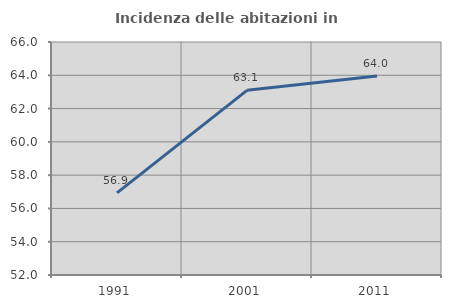
| Category | Incidenza delle abitazioni in proprietà  |
|---|---|
| 1991.0 | 56.935 |
| 2001.0 | 63.095 |
| 2011.0 | 63.962 |